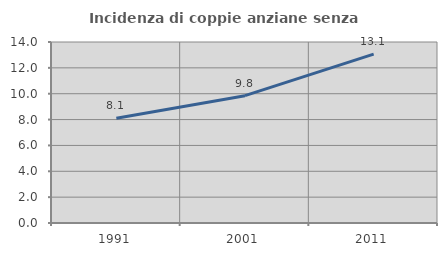
| Category | Incidenza di coppie anziane senza figli  |
|---|---|
| 1991.0 | 8.11 |
| 2001.0 | 9.847 |
| 2011.0 | 13.063 |